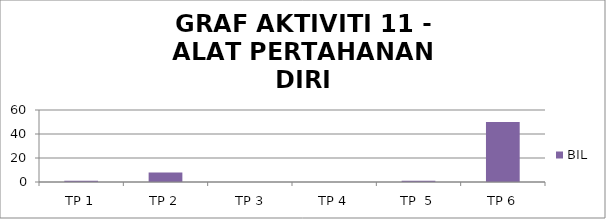
| Category | BIL |
|---|---|
| TP 1 | 1 |
| TP 2 | 8 |
|  TP 3 | 0 |
| TP 4 | 0 |
| TP  5 | 1 |
| TP 6 | 50 |